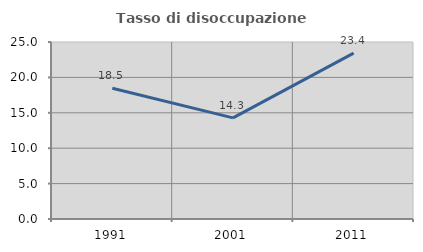
| Category | Tasso di disoccupazione giovanile  |
|---|---|
| 1991.0 | 18.461 |
| 2001.0 | 14.289 |
| 2011.0 | 23.423 |